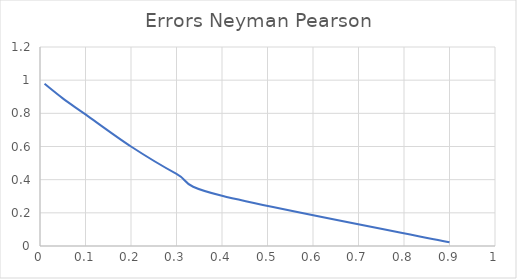
| Category | Series 0 |
|---|---|
| 0.01 | 0.978 |
| 0.05 | 0.89 |
| 0.1 | 0.793 |
| 0.2 | 0.6 |
| 0.3 | 0.435 |
| 0.4 | 0.303 |
| 0.9 | 0.022 |